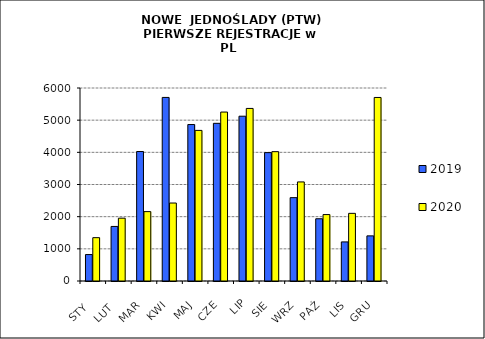
| Category | 2019 | 2020 |
|---|---|---|
|  STY  | 822 | 1347 |
|  LUT  | 1696 | 1953 |
| MAR | 4025 | 2157 |
| KWI | 5707 | 2424 |
| MAJ | 4864 | 4682 |
| CZE | 4902 | 5252 |
| LIP | 5123 | 5365 |
| SIE | 3991 | 4021 |
| WRZ | 2591 | 3080 |
| PAŹ | 1935 | 2065 |
| LIS | 1215 | 2103 |
| GRU | 1403 | 5706 |